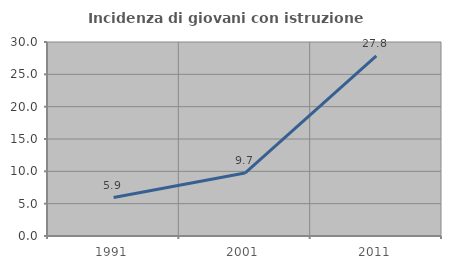
| Category | Incidenza di giovani con istruzione universitaria |
|---|---|
| 1991.0 | 5.941 |
| 2001.0 | 9.74 |
| 2011.0 | 27.848 |